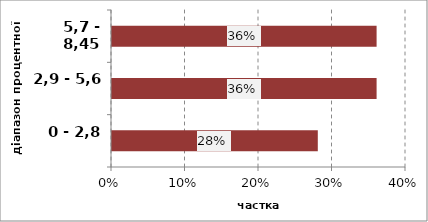
| Category | Series 0 |
|---|---|
| 0 - 2,8 | 0.28 |
| 2,9 - 5,6 | 0.36 |
| 5,7 - 8,45 | 0.36 |